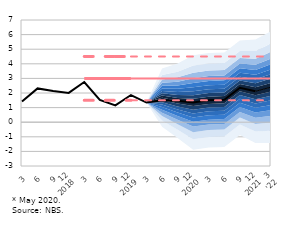
| Category | Series 5 | Series 25 | Series 24 | Series 23 |
|---|---|---|---|---|
| 3 | 1.417 | 3 | 1.5 | 4.5 |
| 6 | 2.314 | 3 | 1.5 | 4.5 |
| 9 | 2.136 | 3 | 1.5 | 4.5 |
| 12
2018 | 2.004 | 3 | 1.5 | 4.5 |
| 3 | 2.751 | 3 | 1.5 | 4.5 |
| 6 | 1.531 | 3 | 1.5 | 4.5 |
| 9 | 1.15 | 3 | 1.5 | 4.5 |
| 12
2019 | 1.861 | 3 | 1.5 | 4.5 |
| 3 | 1.344 | 3 | 1.5 | 4.5 |
| 6 | 1.5 | 3 | 1.5 | 4.5 |
| 9 | 1.47 | 3 | 1.5 | 4.5 |
| 12
2020 | 1.356 | 3 | 1.5 | 4.5 |
| 3 | 1.501 | 3 | 1.5 | 4.5 |
| 6 | 1.54 | 3 | 1.5 | 4.5 |
| 9 | 2.361 | 3 | 1.5 | 4.5 |
| 12
2021 | 2.119 | 3 | 1.5 | 4.5 |
| 3
'22 | 2.4 | 3 | 1.5 | 4.5 |